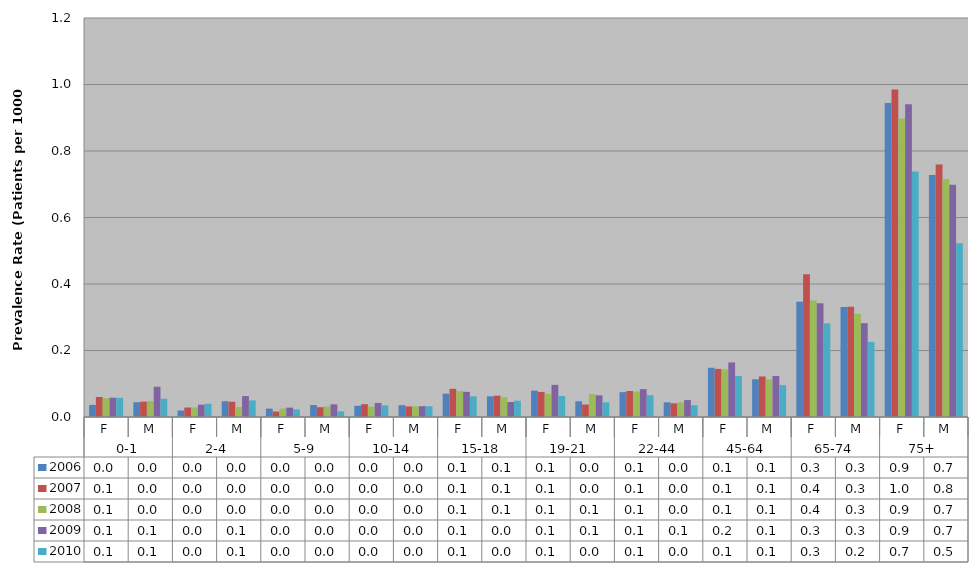
| Category | 2006 | 2007 | 2008 | 2009 | 2010 |
|---|---|---|---|---|---|
| 0 | 0.036 | 0.06 | 0.057 | 0.058 | 0.058 |
| 1 | 0.044 | 0.046 | 0.048 | 0.091 | 0.055 |
| 2 | 0.02 | 0.029 | 0.029 | 0.037 | 0.04 |
| 3 | 0.047 | 0.046 | 0.03 | 0.063 | 0.05 |
| 4 | 0.025 | 0.016 | 0.026 | 0.028 | 0.023 |
| 5 | 0.036 | 0.029 | 0.031 | 0.038 | 0.017 |
| 6 | 0.034 | 0.039 | 0.031 | 0.042 | 0.035 |
| 7 | 0.036 | 0.032 | 0.032 | 0.032 | 0.032 |
| 8 | 0.07 | 0.085 | 0.078 | 0.076 | 0.062 |
| 9 | 0.062 | 0.064 | 0.06 | 0.045 | 0.049 |
| 10 | 0.079 | 0.075 | 0.07 | 0.097 | 0.063 |
| 11 | 0.047 | 0.037 | 0.069 | 0.065 | 0.044 |
| 12 | 0.075 | 0.078 | 0.076 | 0.084 | 0.066 |
| 13 | 0.044 | 0.041 | 0.044 | 0.051 | 0.035 |
| 14 | 0.148 | 0.145 | 0.143 | 0.164 | 0.124 |
| 15 | 0.113 | 0.122 | 0.113 | 0.123 | 0.096 |
| 16 | 0.347 | 0.429 | 0.35 | 0.342 | 0.282 |
| 17 | 0.331 | 0.332 | 0.311 | 0.282 | 0.226 |
| 18 | 0.945 | 0.985 | 0.897 | 0.941 | 0.738 |
| 19 | 0.728 | 0.76 | 0.716 | 0.698 | 0.523 |